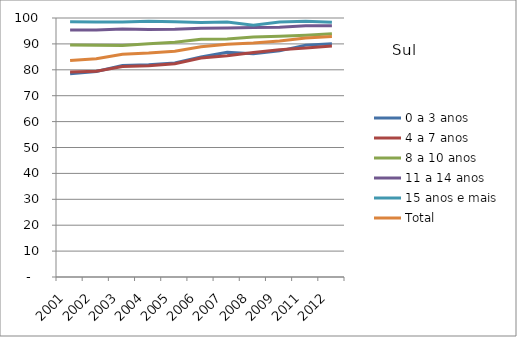
| Category | 0 a 3 anos | 4 a 7 anos | 8 a 10 anos | 11 a 14 anos | 15 anos e mais | Total |
|---|---|---|---|---|---|---|
| 2001.0 | 78.47 | 79.11 | 89.57 | 95.32 | 98.54 | 83.57 |
| 2002.0 | 79.32 | 79.47 | 89.5 | 95.37 | 98.48 | 84.25 |
| 2003.0 | 81.62 | 81.29 | 89.35 | 95.71 | 98.47 | 85.98 |
| 2004.0 | 81.96 | 81.55 | 90.07 | 95.56 | 98.74 | 86.44 |
| 2005.0 | 82.63 | 82.35 | 90.66 | 95.66 | 98.51 | 87.15 |
| 2006.0 | 84.95 | 84.57 | 91.78 | 96.05 | 98.31 | 88.89 |
| 2007.0 | 86.78 | 85.46 | 91.89 | 96.15 | 98.43 | 89.85 |
| 2008.0 | 86.18 | 86.71 | 92.67 | 96.37 | 97.2 | 90.33 |
| 2009.0 | 87.31 | 87.7 | 92.92 | 96.41 | 98.45 | 91.15 |
| 2011.0 | 89.53 | 88.43 | 93.36 | 96.96 | 98.75 | 92.32 |
| 2012.0 | 90.08 | 89.18 | 93.94 | 97.02 | 98.37 | 92.81 |